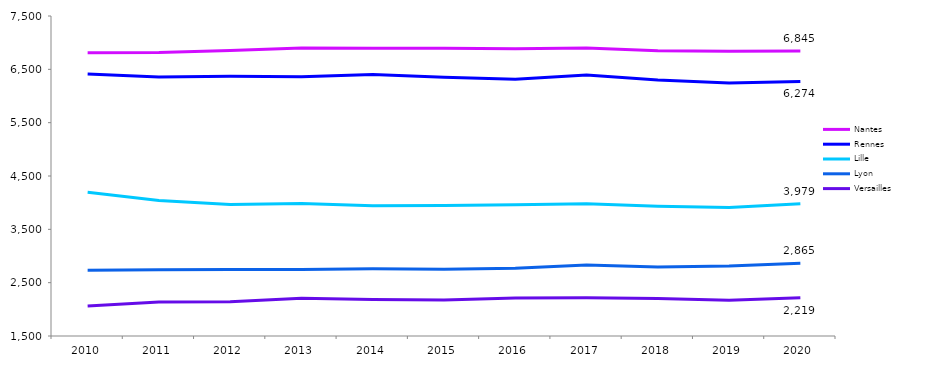
| Category | Nantes | Rennes | Lille | Lyon | Versailles |
|---|---|---|---|---|---|
| 2010.0 | 6810 | 6412 | 4194 | 2735 | 2061 |
| 2011.0 | 6814 | 6357 | 4041 | 2740 | 2136 |
| 2012.0 | 6852 | 6371 | 3967 | 2749 | 2143 |
| 2013.0 | 6900 | 6362 | 3986 | 2745 | 2207 |
| 2014.0 | 6896 | 6405 | 3941 | 2760 | 2186 |
| 2015.0 | 6894 | 6353 | 3948 | 2751 | 2177 |
| 2016.0 | 6885 | 6314 | 3963 | 2770 | 2213 |
| 2017.0 | 6898 | 6396 | 3979 | 2829 | 2216 |
| 2018.0 | 6847 | 6300 | 3933 | 2794 | 2201 |
| 2019.0 | 6841 | 6242 | 3909 | 2811 | 2172 |
| 2020.0 | 6845 | 6274 | 3979 | 2865 | 2219 |